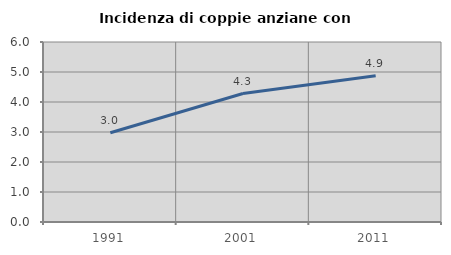
| Category | Incidenza di coppie anziane con figli |
|---|---|
| 1991.0 | 2.974 |
| 2001.0 | 4.283 |
| 2011.0 | 4.878 |